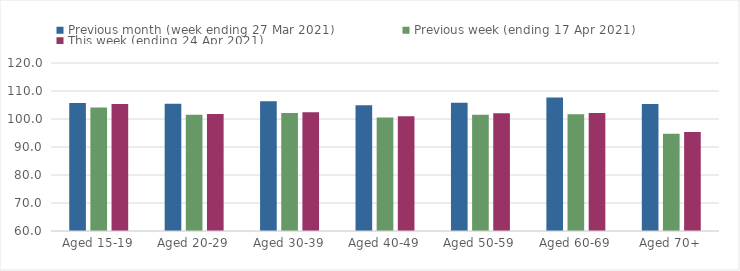
| Category | Previous month (week ending 27 Mar 2021) | Previous week (ending 17 Apr 2021) | This week (ending 24 Apr 2021) |
|---|---|---|---|
| Aged 15-19 | 105.67 | 104.14 | 105.34 |
| Aged 20-29 | 105.41 | 101.52 | 101.83 |
| Aged 30-39 | 106.34 | 102.12 | 102.41 |
| Aged 40-49 | 104.91 | 100.51 | 101.02 |
| Aged 50-59 | 105.78 | 101.51 | 102.04 |
| Aged 60-69 | 107.66 | 101.72 | 102.12 |
| Aged 70+ | 105.39 | 94.77 | 95.4 |